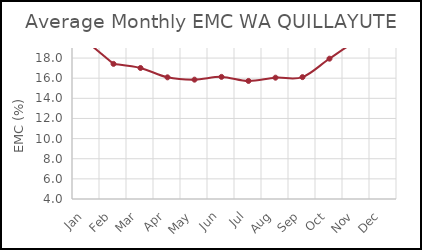
| Category | WA QUILLAYUTE |
|---|---|
| Jan | 19.654 |
| Feb | 17.422 |
| Mar | 17.015 |
| Apr | 16.086 |
| May | 15.856 |
| Jun | 16.131 |
| Jul | 15.727 |
| Aug | 16.052 |
| Sep | 16.109 |
| Oct | 17.94 |
| Nov | 19.629 |
| Dec | 20.18 |